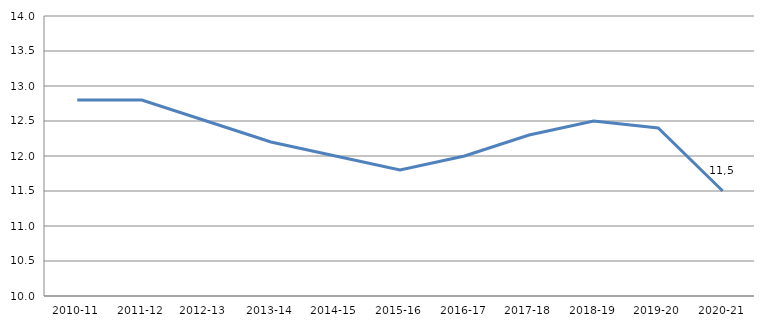
| Category | Series 0 |
|---|---|
| 2010-11 | 12.8 |
| 2011-12 | 12.8 |
| 2012-13  | 12.5 |
| 2013-14 | 12.2 |
| 2014-15 | 12 |
| 2015-16 | 11.8 |
| 2016-17 | 12 |
| 2017-18 | 12.3 |
| 2018-19 | 12.5 |
| 2019-20 | 12.4 |
| 2020-21 | 11.5 |